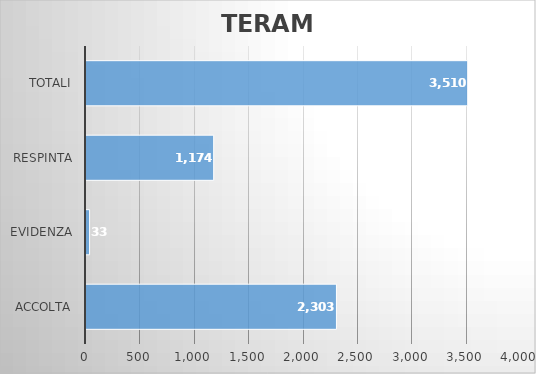
| Category | TERAMO |
|---|---|
| ACCOLTA | 2303 |
| EVIDENZA | 33 |
| RESPINTA | 1174 |
| Totali | 3510 |